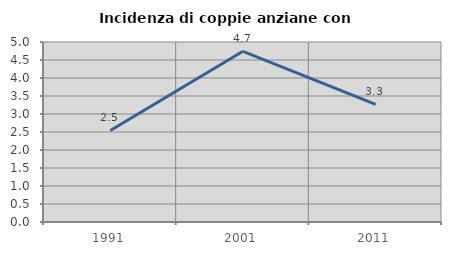
| Category | Incidenza di coppie anziane con figli |
|---|---|
| 1991.0 | 2.544 |
| 2001.0 | 4.741 |
| 2011.0 | 3.266 |